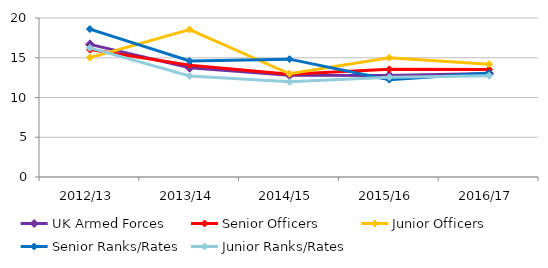
| Category | UK Armed Forces | Senior Officers | Junior Officers | Senior Ranks/Rates | Junior Ranks/Rates |
|---|---|---|---|---|---|
| 2012/13 | 16.684 | 16.025 | 15.021 | 18.608 | 16.237 |
| 2013/14 | 13.733 | 14.071 | 18.549 | 14.587 | 12.705 |
| 2014/15 | 12.811 | 12.933 | 12.986 | 14.825 | 11.973 |
| 2015/16 | 12.77 | 13.538 | 15.007 | 12.247 | 12.554 |
| 2016/17 | 13.018 | 13.522 | 14.197 | 13.068 | 12.748 |